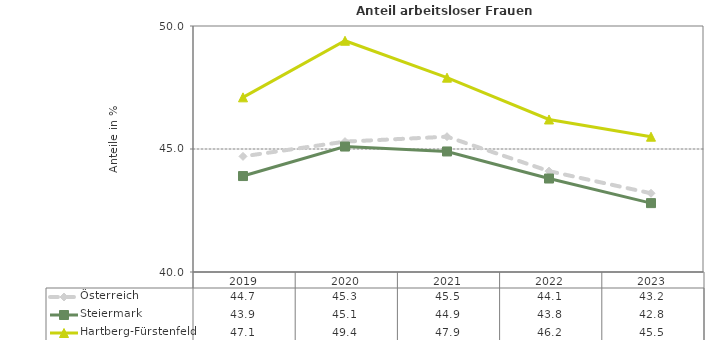
| Category | Österreich | Steiermark | Hartberg-Fürstenfeld |
|---|---|---|---|
| 2023.0 | 43.2 | 42.8 | 45.5 |
| 2022.0 | 44.1 | 43.8 | 46.2 |
| 2021.0 | 45.5 | 44.9 | 47.9 |
| 2020.0 | 45.3 | 45.1 | 49.4 |
| 2019.0 | 44.7 | 43.9 | 47.1 |